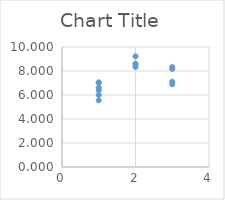
| Category | Series 0 |
|---|---|
| 1.0 | 7.056 |
| 1.0 | 7 |
| 1.0 | 6.611 |
| 1.0 | 5.556 |
| 1.0 | 6 |
| 1.0 | 6.389 |
| 2.0 | 8.556 |
| 2.0 | 8.611 |
| 2.0 | 9.222 |
| 2.0 | 8.333 |
| 3.0 | 8.167 |
| 3.0 | 6.889 |
| 3.0 | 8.333 |
| 3.0 | 7.111 |